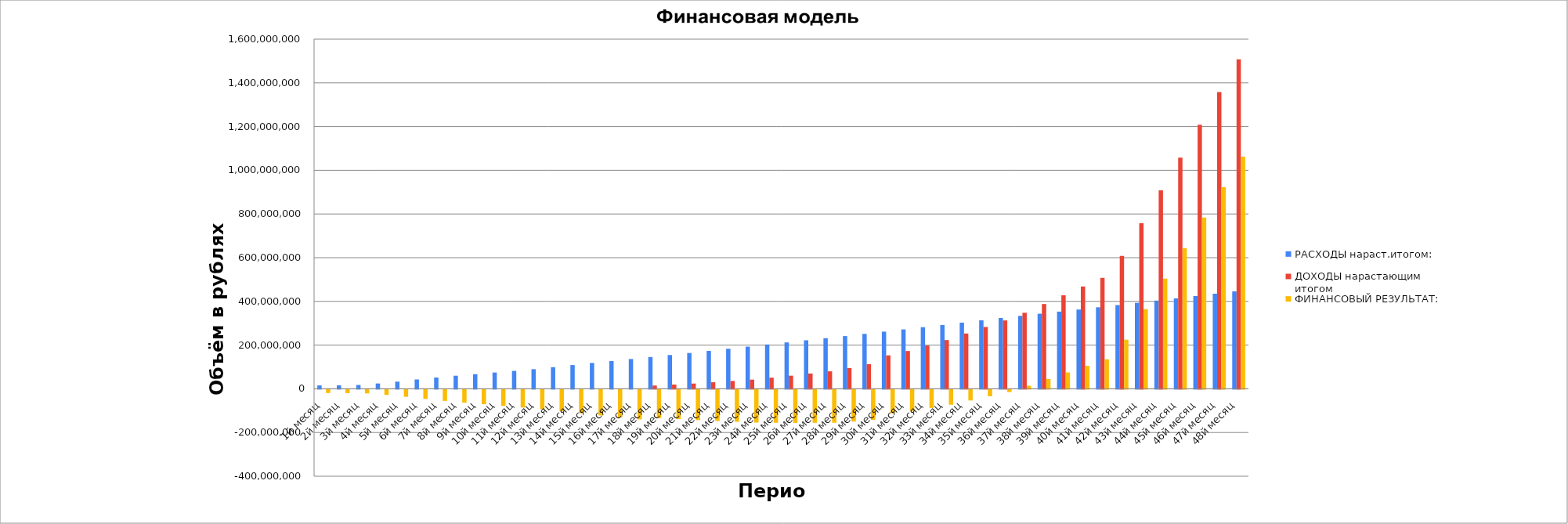
| Category | РАСХОДЫ нараст.итогом: | ДОХОДЫ нарастающим итогом | ФИНАНСОВЫЙ РЕЗУЛЬТАТ: |
|---|---|---|---|
| 1й месяц | 15550000 | 0 | -15550000 |
| 2й месяц | 16100000 | 0 | -16100000 |
| 3й месяц | 17650000 | 0 | -17650000 |
| 4й месяц | 24300000 | 0 | -24300000 |
| 5й месяц | 32950000 | 0 | -32950000 |
| 6й месяц | 42700000 | 0 | -42700000 |
| 7й месяц | 51750000 | 0 | -51750000 |
| 8й месяц | 59850000 | 0 | -59850000 |
| 9й месяц | 67050000 | 0 | -67050000 |
| 10й месяц | 74450000 | 0 | -74450000 |
| 11й месяц | 82050000 | 0 | -82050000 |
| 12й месяц | 89650000 | 0 | -89650000 |
| 13й месяц | 98900000 | 0 | -98900000 |
| 14й месяц | 108650000 | 0 | -108650000 |
| 15й месяц | 118400000 | 0 | -118400000 |
| 16й месяц | 127150000 | 0 | -127150000 |
| 17й месяц | 136300000 | 0 | -136300000 |
| 18й месяц | 145450000 | 15000000 | -130450000 |
| 19й месяц | 154650000 | 19500000 | -135150000 |
| 20й месяц | 163850000 | 24000000 | -139850000 |
| 21й месяц | 173550000 | 30000000 | -143550000 |
| 22й месяц | 183250000 | 36000000 | -147250000 |
| 23й месяц | 192950000 | 42000000 | -150950000 |
| 24й месяц | 202650000 | 51000000 | -151650000 |
| 25й месяц | 212300001 | 60000000 | -152300001 |
| 26й месяц | 221950003 | 70000000 | -151950003 |
| 27й месяц | 231600006 | 80000000 | -151600006 |
| 28й месяц | 241250010 | 95000000 | -146250010 |
| 29й месяц | 251400015 | 113000000 | -138400015 |
| 30й месяц | 261550021 | 153000000 | -108550021 |
| 31й месяц | 271750028 | 173000000 | -98750028 |
| 32й месяц | 281950036 | 198000000 | -83950036 |
| 33й месяц | 292150045 | 223000000 | -69150045 |
| 34й месяц | 302850055 | 253000000 | -49850055 |
| 35й месяц | 313550066 | 283000000 | -30550066 |
| 36й месяц | 324250078 | 313000000 | -11250078 |
| 37й месяц | 333900079 | 348000000 | 14099921 |
| 38й месяц | 343550081 | 388000000 | 44449919 |
| 39й месяц | 353200084 | 428000000 | 74799916 |
| 40й месяц | 362850088 | 468000000 | 105149912 |
| 41й месяц | 373000093 | 508000000 | 134999907 |
| 42й месяц | 383150099 | 608000000 | 224849901 |
| 43й месяц | 393350106 | 758000000 | 364649894 |
| 44й месяц | 403550114 | 908000000 | 504449886 |
| 45й месяц | 413750123 | 1058000000 | 644249877 |
| 46й месяц | 424450133 | 1208000000 | 783549867 |
| 47й месяц | 435150144 | 1358000000 | 922849856 |
| 48й месяц | 445850156 | 1508000000 | 1062149844 |